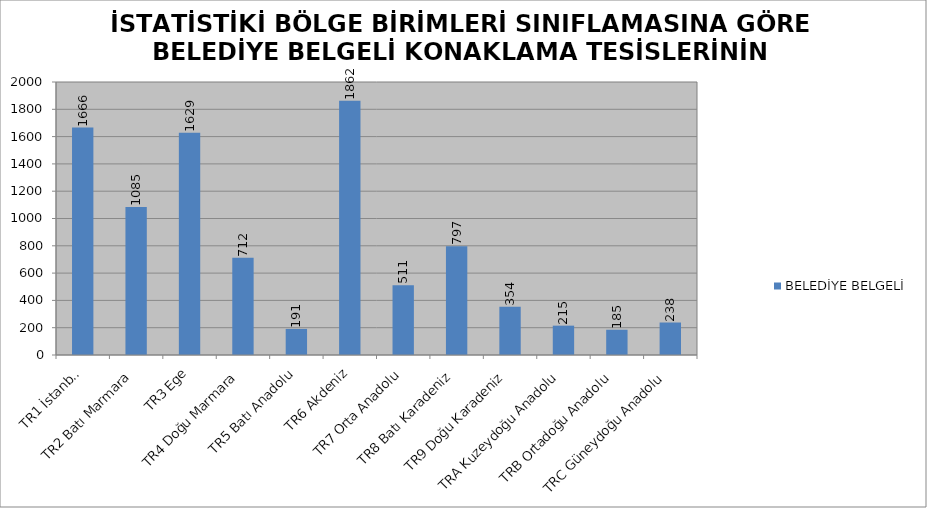
| Category | BELEDİYE BELGELİ |
|---|---|
| TR1 İstanbul | 1666 |
| TR2 Batı Marmara | 1085 |
| TR3 Ege | 1629 |
| TR4 Doğu Marmara | 712 |
| TR5 Batı Anadolu | 191 |
| TR6 Akdeniz | 1862 |
| TR7 Orta Anadolu | 511 |
| TR8 Batı Karadeniz | 797 |
| TR9 Doğu Karadeniz | 354 |
| TRA Kuzeydoğu Anadolu | 215 |
| TRB Ortadoğu Anadolu | 185 |
| TRC Güneydoğu Anadolu | 238 |